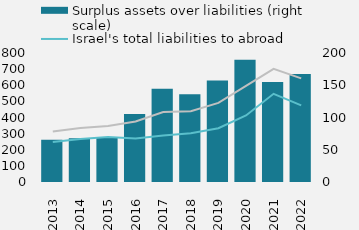
| Category | Surplus assets over liabilities (right scale) |
|---|---|
| 2013.0 | 65347.238 |
| 2014.0 | 67665.623 |
| 2015.0 | 68284.455 |
| 2016.0 | 105525.4 |
| 2017.0 | 144442.727 |
| 2018.0 | 136097.052 |
| 2019.0 | 157511.773 |
| 2020.0 | 189690.435 |
| 2021.0 | 154863 |